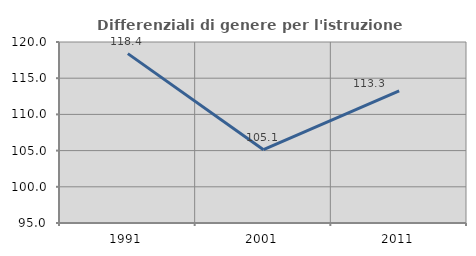
| Category | Differenziali di genere per l'istruzione superiore |
|---|---|
| 1991.0 | 118.392 |
| 2001.0 | 105.128 |
| 2011.0 | 113.259 |